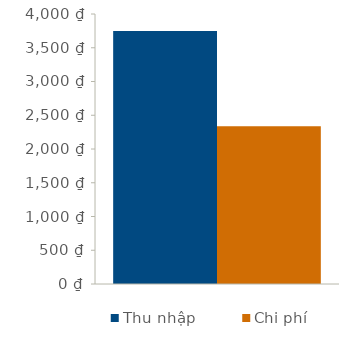
| Category | Thu nhập | Chi phí |
|---|---|---|
| 0 | 3750 | 2336 |